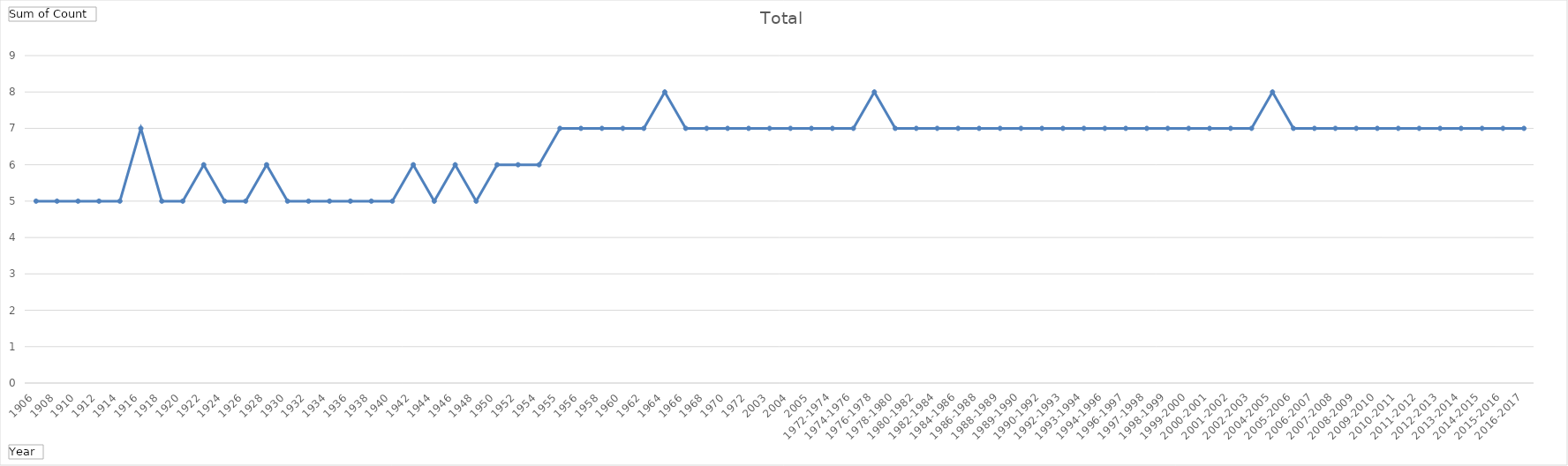
| Category | Total |
|---|---|
| 1906 | 5 |
| 1908 | 5 |
| 1910 | 5 |
| 1912 | 5 |
| 1914 | 5 |
| 1916 | 7 |
| 1918 | 5 |
| 1920 | 5 |
| 1922 | 6 |
| 1924 | 5 |
| 1926 | 5 |
| 1928 | 6 |
| 1930 | 5 |
| 1932 | 5 |
| 1934 | 5 |
| 1936 | 5 |
| 1938 | 5 |
| 1940 | 5 |
| 1942 | 6 |
| 1944 | 5 |
| 1946 | 6 |
| 1948 | 5 |
| 1950 | 6 |
| 1952 | 6 |
| 1954 | 6 |
| 1955 | 7 |
| 1956 | 7 |
| 1958 | 7 |
| 1960 | 7 |
| 1962 | 7 |
| 1964 | 8 |
| 1966 | 7 |
| 1968 | 7 |
| 1970 | 7 |
| 1972 | 7 |
| 2003 | 7 |
| 2004 | 7 |
| 2005 | 7 |
| 1972-1974 | 7 |
| 1974-1976 | 7 |
| 1976-1978 | 8 |
| 1978-1980 | 7 |
| 1980-1982 | 7 |
| 1982-1984 | 7 |
| 1984-1986 | 7 |
| 1986-1988 | 7 |
| 1988-1989 | 7 |
| 1989-1990 | 7 |
| 1990-1992 | 7 |
| 1992-1993 | 7 |
| 1993-1994 | 7 |
| 1994-1996 | 7 |
| 1996-1997 | 7 |
| 1997-1998 | 7 |
| 1998-1999 | 7 |
| 1999-2000 | 7 |
| 2000-2001 | 7 |
| 2001-2002 | 7 |
| 2002-2003 | 7 |
| 2004-2005 | 8 |
| 2005-2006 | 7 |
| 2006-2007 | 7 |
| 2007-2008 | 7 |
| 2008-2009 | 7 |
| 2009-2010 | 7 |
| 2010-2011 | 7 |
| 2011-2012 | 7 |
| 2012-2013 | 7 |
| 2013-2014 | 7 |
| 2014-2015 | 7 |
| 2015-2016 | 7 |
| 2016-2017 | 7 |